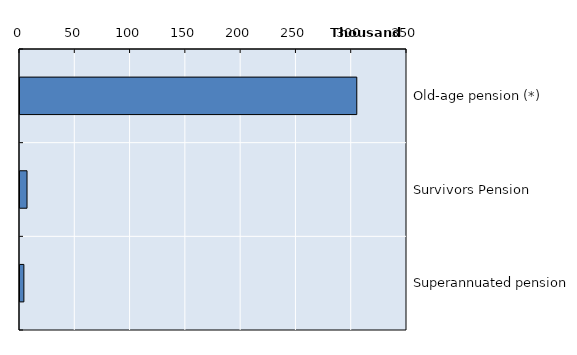
| Category | Series 0 |
|---|---|
| Old-age pension (*) | 304593 |
| Survivors Pension | 6359 |
| Superannuated pension | 3507 |